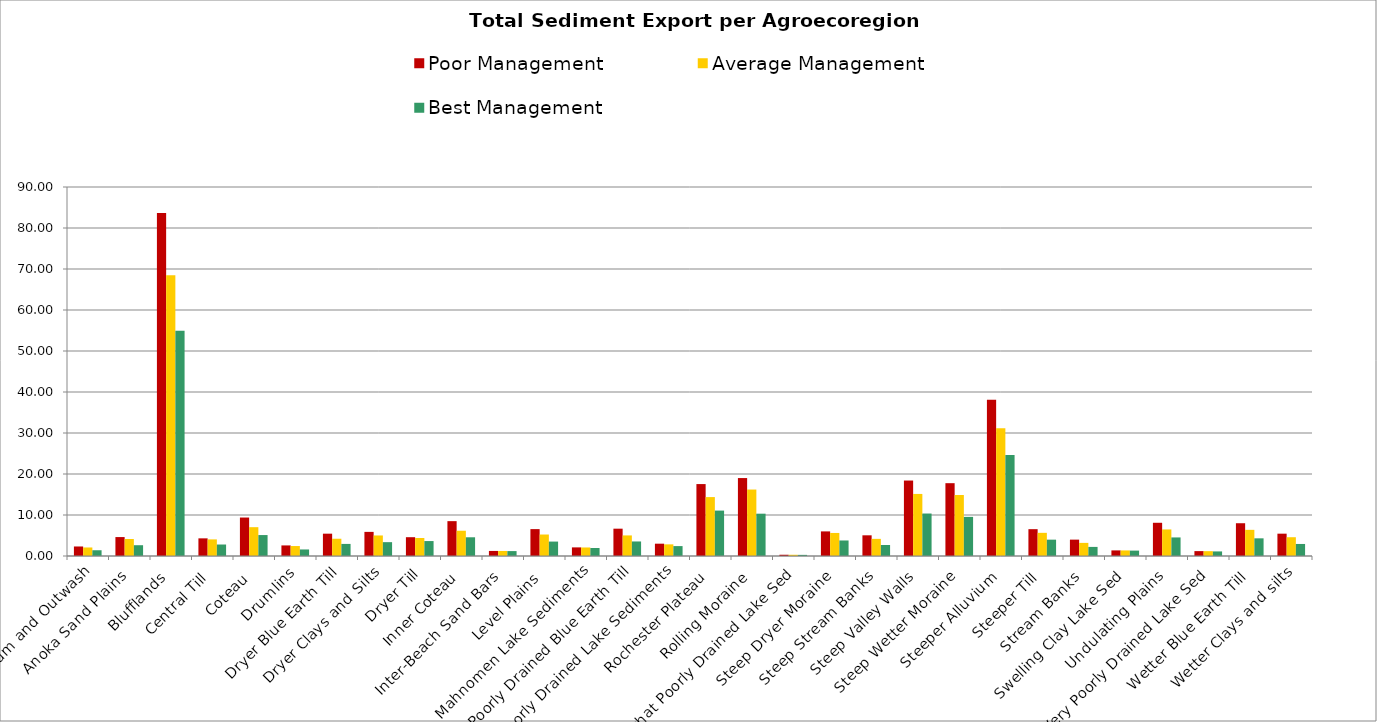
| Category | Poor Management | Average Management | Best Management |
|---|---|---|---|
| Alluvium and Outwash | 2.322 | 2.08 | 1.403 |
| Anoka Sand Plains | 4.617 | 4.14 | 2.631 |
| Blufflands | 83.668 | 68.47 | 54.938 |
| Central Till | 4.305 | 4.05 | 2.802 |
| Coteau | 9.382 | 7.03 | 5.108 |
| Drumlins | 2.581 | 2.43 | 1.595 |
| Dryer Blue Earth Till | 5.445 | 4.21 | 2.947 |
| Dryer Clays and Silts | 5.883 | 5.01 | 3.377 |
| Dryer Till | 4.586 | 4.39 | 3.644 |
| Inner Coteau | 8.502 | 6.16 | 4.566 |
| Inter-Beach Sand Bars | 1.235 | 1.23 | 1.198 |
| Level Plains | 6.558 | 5.24 | 3.519 |
| Mahnomen Lake Sediments | 2.101 | 2.08 | 1.946 |
| Poorly Drained Blue Earth Till | 6.663 | 5.02 | 3.545 |
| Poorly Drained Lake Sediments | 3.004 | 2.84 | 2.416 |
| Rochester Plateau | 17.544 | 14.37 | 11.076 |
| Rolling Moraine | 19.01 | 16.21 | 10.321 |
| Somewhat Poorly Drained Lake Sed | 0.304 | 0.3 | 0.274 |
| Steep Dryer Moraine | 6.001 | 5.62 | 3.788 |
| Steep Stream Banks | 5.046 | 4.18 | 2.687 |
| Steep Valley Walls | 18.405 | 15.14 | 10.36 |
| Steep Wetter Moraine | 17.76 | 14.88 | 9.538 |
| Steeper Alluvium | 38.08 | 31.13 | 24.614 |
| Steeper Till | 6.543 | 5.65 | 3.985 |
| Stream Banks | 3.993 | 3.2 | 2.218 |
| Swelling Clay Lake Sed | 1.367 | 1.36 | 1.314 |
| Undulating Plains | 8.103 | 6.48 | 4.528 |
| Very Poorly Drained Lake Sed | 1.192 | 1.18 | 1.118 |
| Wetter Blue Earth Till  | 7.993 | 6.38 | 4.309 |
| Wetter Clays and silts | 5.447 | 4.58 | 2.935 |